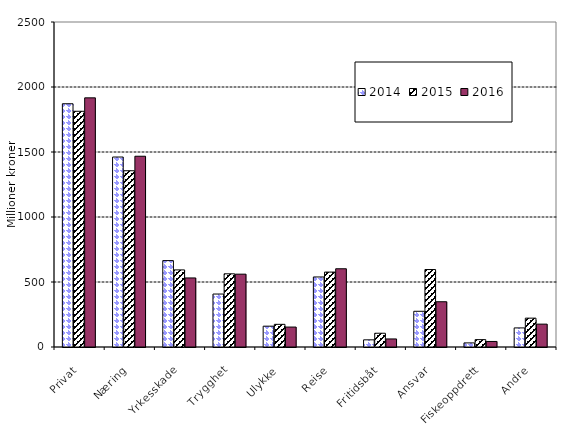
| Category | 2014 | 2015 | 2016 |
|---|---|---|---|
| Privat | 1871.231 | 1813.252 | 1916.538 |
| Næring | 1461.348 | 1355.81 | 1467.402 |
| Yrkesskade | 664.563 | 593.14 | 531.15 |
| Trygghet | 407.336 | 562.936 | 560.289 |
| Ulykke | 160.152 | 174.301 | 153.419 |
| Reise | 538.801 | 576.207 | 601.816 |
| Fritidsbåt | 55.152 | 105.77 | 61.956 |
| Ansvar | 274.756 | 595.919 | 348.152 |
| Fiskeoppdrett | 31.601 | 56.686 | 42.667 |
| Andre | 146.769 | 221.937 | 175.866 |